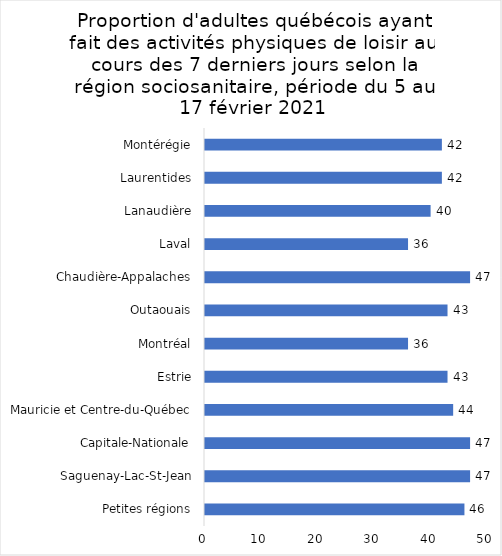
| Category | Series 0 |
|---|---|
| Petites régions | 46 |
| Saguenay-Lac-St-Jean | 47 |
| Capitale-Nationale | 47 |
| Mauricie et Centre-du-Québec | 44 |
| Estrie | 43 |
| Montréal | 36 |
| Outaouais | 43 |
| Chaudière-Appalaches | 47 |
| Laval | 36 |
| Lanaudière | 40 |
| Laurentides | 42 |
| Montérégie | 42 |